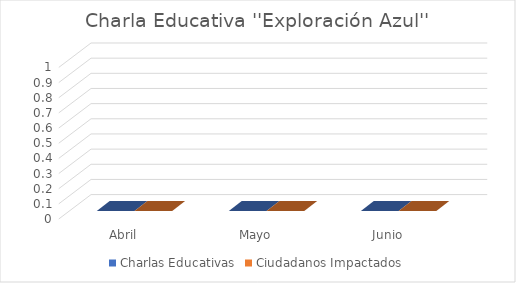
| Category | Charlas Educativas | Ciudadanos Impactados |
|---|---|---|
| Abril | 0 | 0 |
| Mayo | 0 | 0 |
| Junio | 0 | 0 |